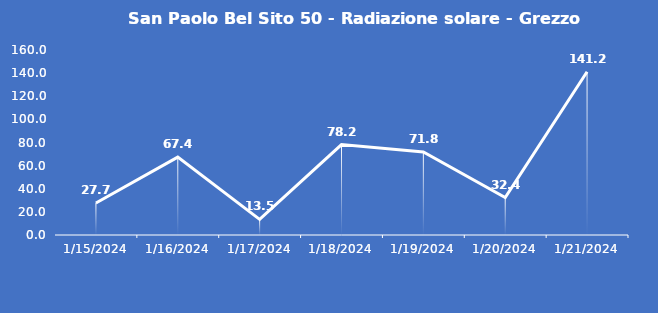
| Category | San Paolo Bel Sito 50 - Radiazione solare - Grezzo (W/m2) |
|---|---|
| 1/15/24 | 27.7 |
| 1/16/24 | 67.4 |
| 1/17/24 | 13.5 |
| 1/18/24 | 78.2 |
| 1/19/24 | 71.8 |
| 1/20/24 | 32.4 |
| 1/21/24 | 141.2 |